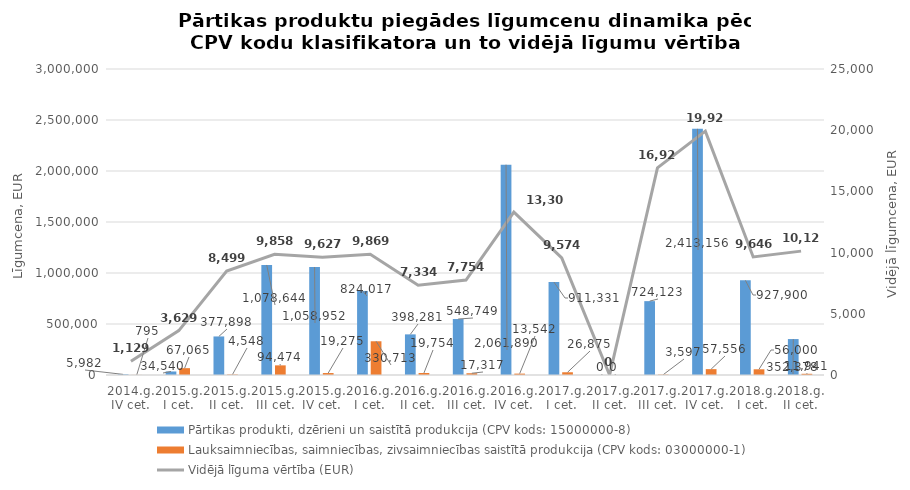
| Category | Pārtikas produkti, dzērieni un saistītā produkcija (CPV kods: 15000000-8) | Lauksaimniecības, saimniecības, zivsaimniecības saistītā produkcija (CPV kods: 03000000-1) |
|---|---|---|
| 2014.g. IV cet. | 5982 | 795 |
| 2015.g. I cet. | 34540 | 67065 |
| 2015.g. II cet. | 377898 | 4548 |
| 2015.g. III cet. | 1078644 | 94474 |
| 2015.g. IV cet. | 1058952 | 19275 |
| 2016.g. I cet. | 824017 | 330713 |
| 2016.g. II cet. | 398281 | 19754 |
| 2016.g. III cet. | 548749.01 | 17317 |
| 2016.g. IV cet. | 2061890 | 13542 |
| 2017.g. I cet. | 911330.81 | 26874.91 |
| 2017.g. II cet. | 0 | 0 |
| 2017.g. III cet. | 724123.07 | 3596.6 |
| 2017.g. IV cet. | 2413156 | 57556 |
| 2018.g. I cet. | 927900 | 56000 |
| 2018.g. II cet. | 352378 | 11941 |